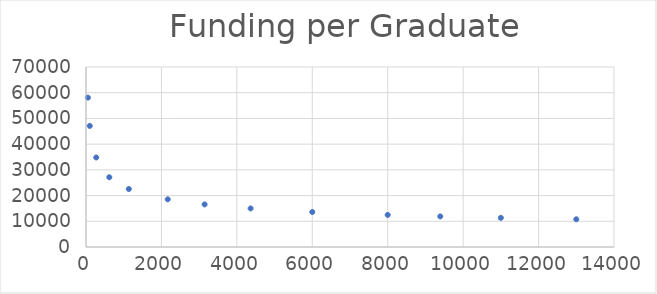
| Category | Funding per Graduate |
|---|---|
| 50.0 | 58098.83 |
| 100.0 | 47092.457 |
| 271.0 | 34814.167 |
| 618.0 | 27118.867 |
| 1136.0 | 22550.593 |
| 2167.0 | 18542.517 |
| 3145.0 | 16563.526 |
| 4365.0 | 14997.358 |
| 6000.0 | 13619.098 |
| 8000.0 | 12482.176 |
| 9394.0 | 11889.181 |
| 11000.0 | 11333.989 |
| 13000.0 | 10774.546 |